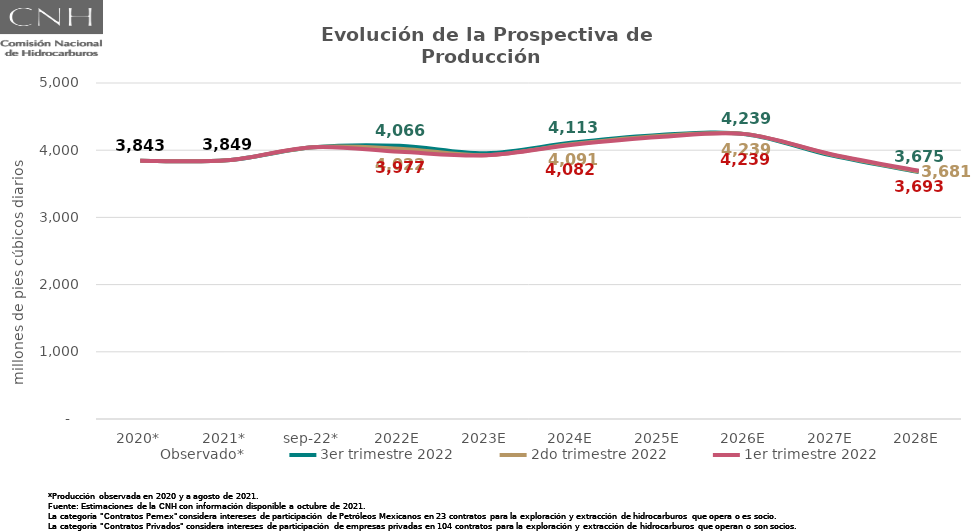
| Category | Observado* | 3er trimestre 2022 | 2do trimestre 2022 | 1er trimestre 2022 |
|---|---|---|---|---|
| 2020* | 3843.295 | 3843.295 | 3843.295 | 3843.295 |
| 2021* | 3849.174 | 3849.174 | 3849.174 | 3849.174 |
| sep-22* | 4044.539 | 4044.539 | 4044.539 | 4044.539 |
| 2022E | 4065.509 | 4065.509 | 4021.769 | 3976.936 |
| 2023E | 3956.237 | 3956.237 | 3925.953 | 3923.539 |
| 2024E | 4113.094 | 4113.094 | 4091.168 | 4081.643 |
| 2025E | 4227.383 | 4227.383 | 4210.236 | 4196.961 |
| 2026E | 4238.731 | 4238.731 | 4239.197 | 4239.087 |
| 2027E | 3918.633 | 3918.633 | 3931.086 | 3937.149 |
| 2028E | 3674.987 | 3674.987 | 3681.179 | 3693.161 |